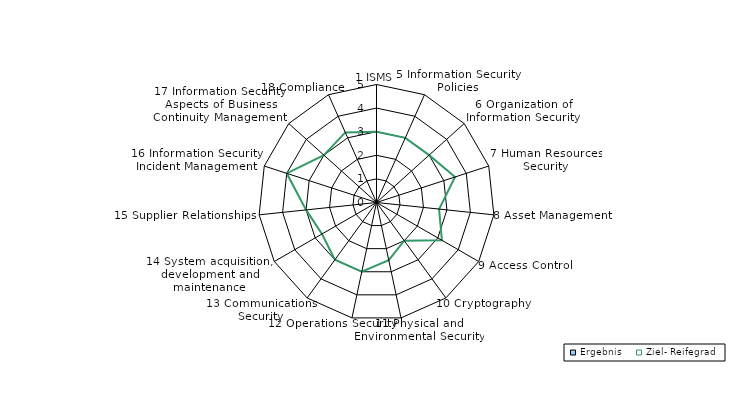
| Category | Ergebnis | Ziel- Reifegrad |
|---|---|---|
| 1 ISMS | 0 | 3 |
| 5 Information Security Policies | 0 | 3 |
| 6 Organization of Information Security | 0 | 3 |
| 7 Human Resources Security | 0 | 3.5 |
| 8 Asset Management | 0 | 2.667 |
| 9 Access Control | 0 | 3.2 |
| 10 Cryptography | 0 | 2 |
| 11 Physical and Environmental Security | 0 | 2.5 |
| 12 Operations Security | 0 | 3 |
| 13 Communications Security | 0 | 3 |
| 14 System acquisition, development and maintenance | 0 | 2.667 |
| 15 Supplier Relationships | 0 | 3 |
| 16 Information Security Incident Management | 0 | 4 |
| 17 Information Security Aspects of Business Continuity Management | 0 | 3 |
| 18 Compliance | 0 | 3.25 |